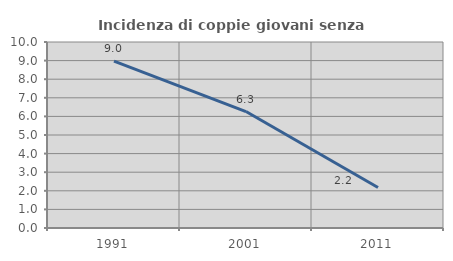
| Category | Incidenza di coppie giovani senza figli |
|---|---|
| 1991.0 | 8.974 |
| 2001.0 | 6.26 |
| 2011.0 | 2.179 |